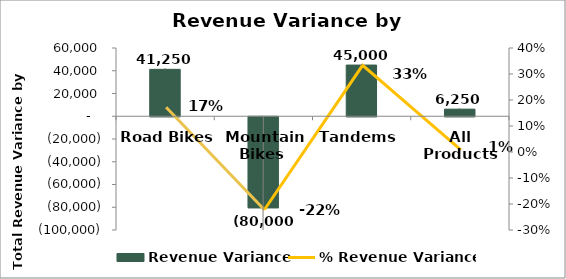
| Category | Revenue Variance  |
|---|---|
| Road Bikes  | 41250 |
| Mountain Bikes  | -80000 |
| Tandems  | 45000 |
| All Products | 6250 |